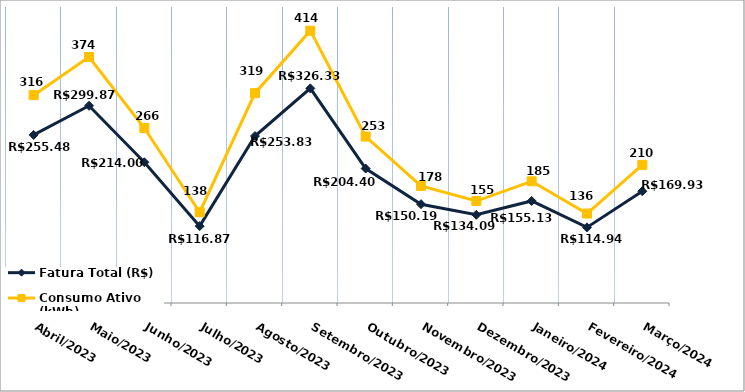
| Category | Fatura Total (R$) | Consumo Ativo (kWh) |
|---|---|---|
| Abril/2023 | 255.48 | 316 |
| Maio/2023 | 299.87 | 374 |
| Junho/2023 | 214 | 266 |
| Julho/2023 | 116.87 | 138 |
| Agosto/2023 | 253.83 | 319 |
| Setembro/2023 | 326.33 | 414 |
| Outubro/2023 | 204.4 | 253 |
| Novembro/2023 | 150.19 | 178 |
| Dezembro/2023 | 134.09 | 155 |
| Janeiro/2024 | 155.13 | 185 |
| Fevereiro/2024 | 114.94 | 136 |
| Março/2024 | 169.93 | 210 |